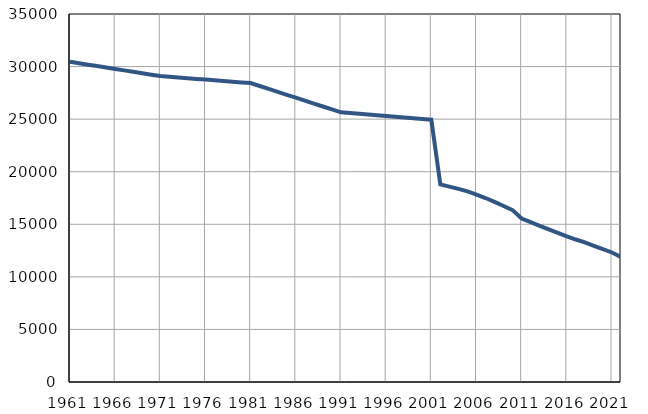
| Category | Population
size |
|---|---|
| 1961.0 | 30452 |
| 1962.0 | 30316 |
| 1963.0 | 30181 |
| 1964.0 | 30045 |
| 1965.0 | 29909 |
| 1966.0 | 29774 |
| 1967.0 | 29638 |
| 1968.0 | 29502 |
| 1969.0 | 29366 |
| 1970.0 | 29230 |
| 1971.0 | 29095 |
| 1972.0 | 29028 |
| 1973.0 | 28962 |
| 1974.0 | 28895 |
| 1975.0 | 28829 |
| 1976.0 | 28762 |
| 1977.0 | 28695 |
| 1978.0 | 28629 |
| 1979.0 | 28562 |
| 1980.0 | 28496 |
| 1981.0 | 28429 |
| 1982.0 | 28151 |
| 1983.0 | 27873 |
| 1984.0 | 27594 |
| 1985.0 | 27317 |
| 1986.0 | 27038 |
| 1987.0 | 26761 |
| 1988.0 | 26483 |
| 1989.0 | 26205 |
| 1990.0 | 25927 |
| 1991.0 | 25649 |
| 1992.0 | 25579 |
| 1993.0 | 25508 |
| 1994.0 | 25438 |
| 1995.0 | 25368 |
| 1996.0 | 25298 |
| 1997.0 | 25226 |
| 1998.0 | 25157 |
| 1999.0 | 25087 |
| 2000.0 | 25017 |
| 2001.0 | 24946 |
| 2002.0 | 18792 |
| 2003.0 | 18583 |
| 2004.0 | 18373 |
| 2005.0 | 18127 |
| 2006.0 | 17825 |
| 2007.0 | 17497 |
| 2008.0 | 17133 |
| 2009.0 | 16738 |
| 2010.0 | 16346 |
| 2011.0 | 15548 |
| 2012.0 | 15201 |
| 2013.0 | 14852 |
| 2014.0 | 14515 |
| 2015.0 | 14192 |
| 2016.0 | 13851 |
| 2017.0 | 13551 |
| 2018.0 | 13273 |
| 2019.0 | 12954 |
| 2020.0 | 12641 |
| 2021.0 | 12317 |
| 2022.0 | 11885 |